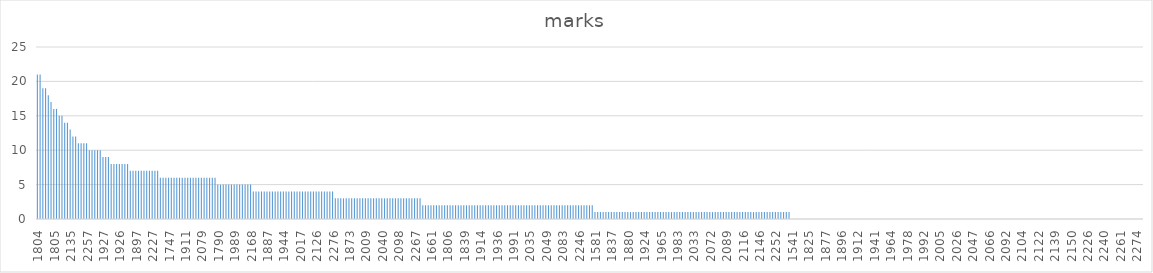
| Category | marks |
|---|---|
| 1804.0 | 21 |
| 1845.0 | 21 |
| 1745.0 | 19 |
| 1946.0 | 19 |
| 1787.0 | 18 |
| 1744.0 | 17 |
| 1805.0 | 16 |
| 1939.0 | 16 |
| 1561.0 | 15 |
| 2271.0 | 15 |
| 1783.0 | 14 |
| 1834.0 | 14 |
| 2135.0 | 13 |
| 1811.0 | 12 |
| 1838.0 | 12 |
| 1943.0 | 11 |
| 2031.0 | 11 |
| 2077.0 | 11 |
| 2257.0 | 11 |
| 1742.0 | 10 |
| 1786.0 | 10 |
| 1836.0 | 10 |
| 2003.0 | 10 |
| 2251.0 | 10 |
| 1927.0 | 9 |
| 1988.0 | 9 |
| 2015.0 | 9 |
| 1784.0 | 8 |
| 1870.0 | 8 |
| 1891.0 | 8 |
| 1926.0 | 8 |
| 1982.0 | 8 |
| 2103.0 | 8 |
| 2238.0 | 8 |
| 1781.0 | 7 |
| 1866.0 | 7 |
| 1897.0 | 7 |
| 1899.0 | 7 |
| 1945.0 | 7 |
| 1961.0 | 7 |
| 1995.0 | 7 |
| 2148.0 | 7 |
| 2227.0 | 7 |
| 2229.0 | 7 |
| 2269.0 | 7 |
| 1602.0 | 6 |
| 1641.0 | 6 |
| 1741.0 | 6 |
| 1747.0 | 6 |
| 1807.0 | 6 |
| 1809.0 | 6 |
| 1832.0 | 6 |
| 1833.0 | 6 |
| 1835.0 | 6 |
| 1911.0 | 6 |
| 1928.0 | 6 |
| 1931.0 | 6 |
| 1987.0 | 6 |
| 2011.0 | 6 |
| 2054.0 | 6 |
| 2079.0 | 6 |
| 2090.0 | 6 |
| 2134.0 | 6 |
| 2143.0 | 6 |
| 2189.0 | 6 |
| 2243.0 | 6 |
| 1790.0 | 5 |
| 1840.0 | 5 |
| 1869.0 | 5 |
| 1879.0 | 5 |
| 1908.0 | 5 |
| 1934.0 | 5 |
| 1989.0 | 5 |
| 1994.0 | 5 |
| 2000.0 | 5 |
| 2057.0 | 5 |
| 2086.0 | 5 |
| 2120.0 | 5 |
| 2168.0 | 5 |
| 1701.0 | 4 |
| 1785.0 | 4 |
| 1788.0 | 4 |
| 1867.0 | 4 |
| 1885.0 | 4 |
| 1887.0 | 4 |
| 1889.0 | 4 |
| 1890.0 | 4 |
| 1895.0 | 4 |
| 1913.0 | 4 |
| 1930.0 | 4 |
| 1944.0 | 4 |
| 1947.0 | 4 |
| 1953.0 | 4 |
| 1962.0 | 4 |
| 1967.0 | 4 |
| 1977.0 | 4 |
| 2017.0 | 4 |
| 2058.0 | 4 |
| 2068.0 | 4 |
| 2074.0 | 4 |
| 2101.0 | 4 |
| 2110.0 | 4 |
| 2126.0 | 4 |
| 2188.0 | 4 |
| 2230.0 | 4 |
| 2248.0 | 4 |
| 2265.0 | 4 |
| 2270.0 | 4 |
| 2276.0 | 4 |
| 1746.0 | 3 |
| 1801.0 | 3 |
| 1812.0 | 3 |
| 1829.0 | 3 |
| 1831.0 | 3 |
| 1873.0 | 3 |
| 1894.0 | 3 |
| 1904.0 | 3 |
| 1950.0 | 3 |
| 1951.0 | 3 |
| 1998.0 | 3 |
| 2009.0 | 3 |
| 2014.0 | 3 |
| 2016.0 | 3 |
| 2028.0 | 3 |
| 2032.0 | 3 |
| 2036.0 | 3 |
| 2040.0 | 3 |
| 2048.0 | 3 |
| 2050.0 | 3 |
| 2070.0 | 3 |
| 2081.0 | 3 |
| 2093.0 | 3 |
| 2098.0 | 3 |
| 2111.0 | 3 |
| 2117.0 | 3 |
| 2121.0 | 3 |
| 2207.0 | 3 |
| 2232.0 | 3 |
| 2267.0 | 3 |
| 2272.0 | 3 |
| 2280.0 | 3 |
| 1582.0 | 2 |
| 1601.0 | 2 |
| 1622.0 | 2 |
| 1661.0 | 2 |
| 1743.0 | 2 |
| 1761.0 | 2 |
| 1762.0 | 2 |
| 1782.0 | 2 |
| 1802.0 | 2 |
| 1806.0 | 2 |
| 1808.0 | 2 |
| 1810.0 | 2 |
| 1816.0 | 2 |
| 1823.0 | 2 |
| 1827.0 | 2 |
| 1839.0 | 2 |
| 1872.0 | 2 |
| 1875.0 | 2 |
| 1884.0 | 2 |
| 1892.0 | 2 |
| 1898.0 | 2 |
| 1914.0 | 2 |
| 1916.0 | 2 |
| 1920.0 | 2 |
| 1921.0 | 2 |
| 1923.0 | 2 |
| 1932.0 | 2 |
| 1936.0 | 2 |
| 1938.0 | 2 |
| 1940.0 | 2 |
| 1948.0 | 2 |
| 1960.0 | 2 |
| 1968.0 | 2 |
| 1991.0 | 2 |
| 1993.0 | 2 |
| 2007.0 | 2 |
| 2024.0 | 2 |
| 2025.0 | 2 |
| 2027.0 | 2 |
| 2035.0 | 2 |
| 2038.0 | 2 |
| 2039.0 | 2 |
| 2041.0 | 2 |
| 2044.0 | 2 |
| 2045.0 | 2 |
| 2049.0 | 2 |
| 2052.0 | 2 |
| 2055.0 | 2 |
| 2060.0 | 2 |
| 2071.0 | 2 |
| 2080.0 | 2 |
| 2083.0 | 2 |
| 2102.0 | 2 |
| 2108.0 | 2 |
| 2125.0 | 2 |
| 2128.0 | 2 |
| 2137.0 | 2 |
| 2246.0 | 2 |
| 2247.0 | 2 |
| 2256.0 | 2 |
| 2259.0 | 2 |
| 2260.0 | 2 |
| 2281.0 | 2 |
| 1581.0 | 1 |
| 1721.0 | 1 |
| 1789.0 | 1 |
| 1803.0 | 1 |
| 1813.0 | 1 |
| 1815.0 | 1 |
| 1837.0 | 1 |
| 1841.0 | 1 |
| 1843.0 | 1 |
| 1846.0 | 1 |
| 1876.0 | 1 |
| 1878.0 | 1 |
| 1880.0 | 1 |
| 1901.0 | 1 |
| 1902.0 | 1 |
| 1905.0 | 1 |
| 1906.0 | 1 |
| 1915.0 | 1 |
| 1924.0 | 1 |
| 1929.0 | 1 |
| 1954.0 | 1 |
| 1956.0 | 1 |
| 1957.0 | 1 |
| 1959.0 | 1 |
| 1965.0 | 1 |
| 1966.0 | 1 |
| 1969.0 | 1 |
| 1970.0 | 1 |
| 1974.0 | 1 |
| 1981.0 | 1 |
| 1983.0 | 1 |
| 2006.0 | 1 |
| 2012.0 | 1 |
| 2019.0 | 1 |
| 2020.0 | 1 |
| 2029.0 | 1 |
| 2033.0 | 1 |
| 2034.0 | 1 |
| 2059.0 | 1 |
| 2063.0 | 1 |
| 2064.0 | 1 |
| 2065.0 | 1 |
| 2072.0 | 1 |
| 2073.0 | 1 |
| 2075.0 | 1 |
| 2085.0 | 1 |
| 2087.0 | 1 |
| 2088.0 | 1 |
| 2089.0 | 1 |
| 2096.0 | 1 |
| 2106.0 | 1 |
| 2107.0 | 1 |
| 2114.0 | 1 |
| 2115.0 | 1 |
| 2116.0 | 1 |
| 2118.0 | 1 |
| 2127.0 | 1 |
| 2136.0 | 1 |
| 2138.0 | 1 |
| 2141.0 | 1 |
| 2146.0 | 1 |
| 2169.0 | 1 |
| 2187.0 | 1 |
| 2228.0 | 1 |
| 2237.0 | 1 |
| 2241.0 | 1 |
| 2252.0 | 1 |
| 2254.0 | 1 |
| 2258.0 | 1 |
| 2273.0 | 1 |
| 2275.0 | 1 |
| 2278.0 | 1 |
| 1541.0 | 0 |
| 1621.0 | 0 |
| 1814.0 | 0 |
| 1821.0 | 0 |
| 1822.0 | 0 |
| 1824.0 | 0 |
| 1825.0 | 0 |
| 1826.0 | 0 |
| 1830.0 | 0 |
| 1842.0 | 0 |
| 1844.0 | 0 |
| 1874.0 | 0 |
| 1877.0 | 0 |
| 1881.0 | 0 |
| 1882.0 | 0 |
| 1883.0 | 0 |
| 1888.0 | 0 |
| 1893.0 | 0 |
| 1896.0 | 0 |
| 1900.0 | 0 |
| 1903.0 | 0 |
| 1907.0 | 0 |
| 1909.0 | 0 |
| 1910.0 | 0 |
| 1912.0 | 0 |
| 1917.0 | 0 |
| 1919.0 | 0 |
| 1925.0 | 0 |
| 1933.0 | 0 |
| 1935.0 | 0 |
| 1941.0 | 0 |
| 1942.0 | 0 |
| 1949.0 | 0 |
| 1952.0 | 0 |
| 1955.0 | 0 |
| 1958.0 | 0 |
| 1964.0 | 0 |
| 1971.0 | 0 |
| 1972.0 | 0 |
| 1973.0 | 0 |
| 1975.0 | 0 |
| 1976.0 | 0 |
| 1978.0 | 0 |
| 1979.0 | 0 |
| 1980.0 | 0 |
| 1984.0 | 0 |
| 1986.0 | 0 |
| 1990.0 | 0 |
| 1992.0 | 0 |
| 1996.0 | 0 |
| 1997.0 | 0 |
| 1999.0 | 0 |
| 2001.0 | 0 |
| 2004.0 | 0 |
| 2005.0 | 0 |
| 2013.0 | 0 |
| 2018.0 | 0 |
| 2021.0 | 0 |
| 2022.0 | 0 |
| 2023.0 | 0 |
| 2026.0 | 0 |
| 2030.0 | 0 |
| 2037.0 | 0 |
| 2042.0 | 0 |
| 2043.0 | 0 |
| 2046.0 | 0 |
| 2047.0 | 0 |
| 2051.0 | 0 |
| 2053.0 | 0 |
| 2056.0 | 0 |
| 2061.0 | 0 |
| 2062.0 | 0 |
| 2066.0 | 0 |
| 2076.0 | 0 |
| 2078.0 | 0 |
| 2082.0 | 0 |
| 2084.0 | 0 |
| 2091.0 | 0 |
| 2092.0 | 0 |
| 2094.0 | 0 |
| 2095.0 | 0 |
| 2097.0 | 0 |
| 2099.0 | 0 |
| 2100.0 | 0 |
| 2104.0 | 0 |
| 2105.0 | 0 |
| 2109.0 | 0 |
| 2112.0 | 0 |
| 2113.0 | 0 |
| 2119.0 | 0 |
| 2122.0 | 0 |
| 2123.0 | 0 |
| 2124.0 | 0 |
| 2129.0 | 0 |
| 2131.0 | 0 |
| 2133.0 | 0 |
| 2139.0 | 0 |
| 2142.0 | 0 |
| 2144.0 | 0 |
| 2145.0 | 0 |
| 2147.0 | 0 |
| 2149.0 | 0 |
| 2150.0 | 0 |
| 2151.0 | 0 |
| 2152.0 | 0 |
| 2167.0 | 0 |
| 2186.0 | 0 |
| 2206.0 | 0 |
| 2226.0 | 0 |
| 2231.0 | 0 |
| 2233.0 | 0 |
| 2234.0 | 0 |
| 2236.0 | 0 |
| 2239.0 | 0 |
| 2240.0 | 0 |
| 2244.0 | 0 |
| 2245.0 | 0 |
| 2249.0 | 0 |
| 2253.0 | 0 |
| 2255.0 | 0 |
| 2261.0 | 0 |
| 2262.0 | 0 |
| 2263.0 | 0 |
| 2264.0 | 0 |
| 2266.0 | 0 |
| 2268.0 | 0 |
| 2274.0 | 0 |
| 2277.0 | 0 |
| 2279.0 | 0 |